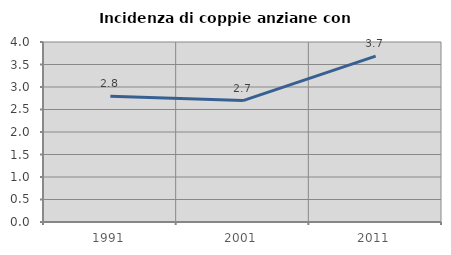
| Category | Incidenza di coppie anziane con figli |
|---|---|
| 1991.0 | 2.797 |
| 2001.0 | 2.697 |
| 2011.0 | 3.685 |